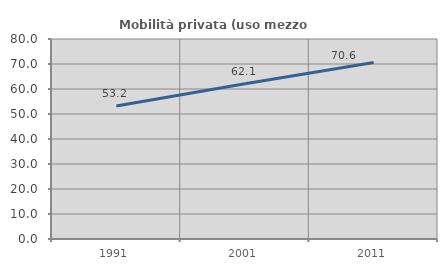
| Category | Mobilità privata (uso mezzo privato) |
|---|---|
| 1991.0 | 53.216 |
| 2001.0 | 62.061 |
| 2011.0 | 70.637 |